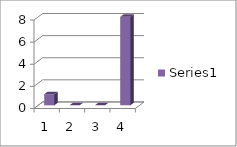
| Category | Series 0 |
|---|---|
| 0 | 1 |
| 1 | 0 |
| 2 | 0 |
| 3 | 8 |